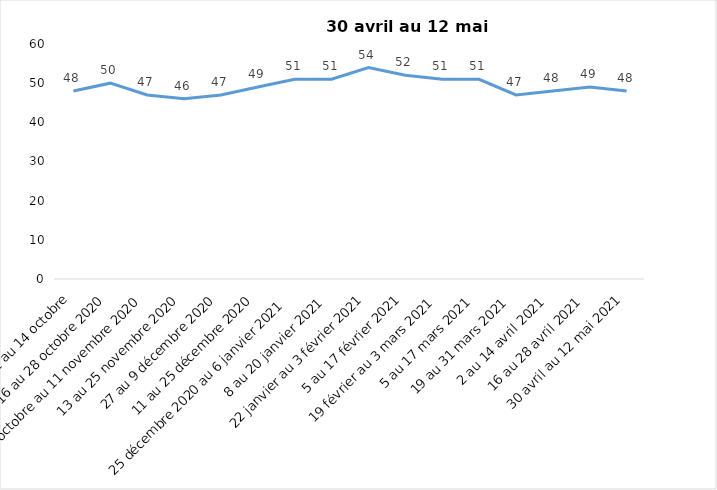
| Category | Toujours aux trois mesures |
|---|---|
| 2 au 14 octobre | 48 |
| 16 au 28 octobre 2020 | 50 |
| 30 octobre au 11 novembre 2020 | 47 |
| 13 au 25 novembre 2020 | 46 |
| 27 au 9 décembre 2020 | 47 |
| 11 au 25 décembre 2020 | 49 |
| 25 décembre 2020 au 6 janvier 2021 | 51 |
| 8 au 20 janvier 2021 | 51 |
| 22 janvier au 3 février 2021 | 54 |
| 5 au 17 février 2021 | 52 |
| 19 février au 3 mars 2021 | 51 |
| 5 au 17 mars 2021 | 51 |
| 19 au 31 mars 2021 | 47 |
| 2 au 14 avril 2021 | 48 |
| 16 au 28 avril 2021 | 49 |
| 30 avril au 12 mai 2021 | 48 |